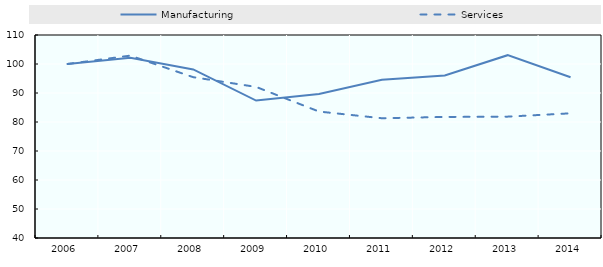
| Category | Manufacturing | Services |
|---|---|---|
| 2006.0 | 100 | 100 |
| 2007.0 | 102.134 | 102.888 |
| 2008.0 | 98.13 | 95.455 |
| 2009.0 | 87.386 | 92.096 |
| 2010.0 | 89.661 | 83.602 |
| 2011.0 | 94.573 | 81.296 |
| 2012.0 | 96.033 | 81.746 |
| 2013.0 | 103.042 | 81.85 |
| 2014.0 | 95.41 | 82.992 |